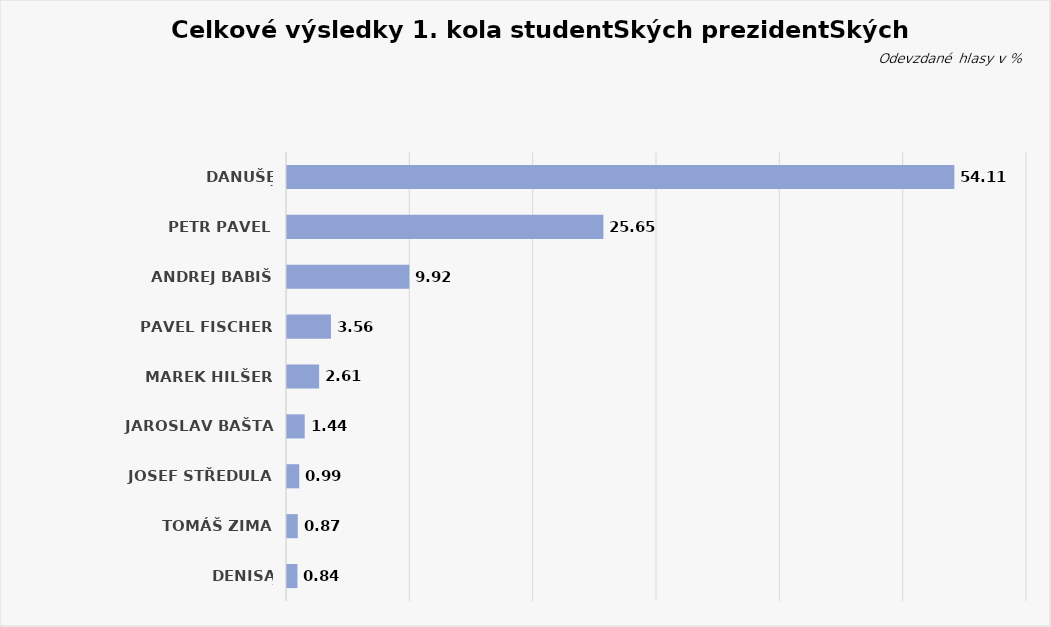
| Category | Series 1 |
|---|---|
| Danuše Nerudová | 54.111 |
| Petr Pavel | 25.654 |
| Andrej Babiš | 9.919 |
| Pavel Fischer | 3.563 |
| Marek Hilšer | 2.606 |
| Jaroslav Bašta | 1.436 |
| Josef Středula | 0.993 |
| Tomáš Zima | 0.873 |
| Denisa Rohanová | 0.845 |